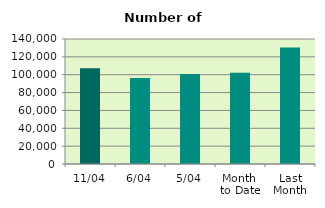
| Category | Series 0 |
|---|---|
| 11/04 | 107364 |
| 6/04 | 96238 |
| 5/04 | 100940 |
| Month 
to Date | 102151.6 |
| Last
Month | 130565.565 |